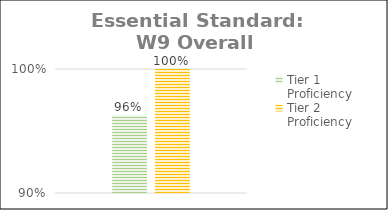
| Category | Tier 1 Proficiency | Tier 2 Proficiency |
|---|---|---|
| 0 | 0.963 | 1 |